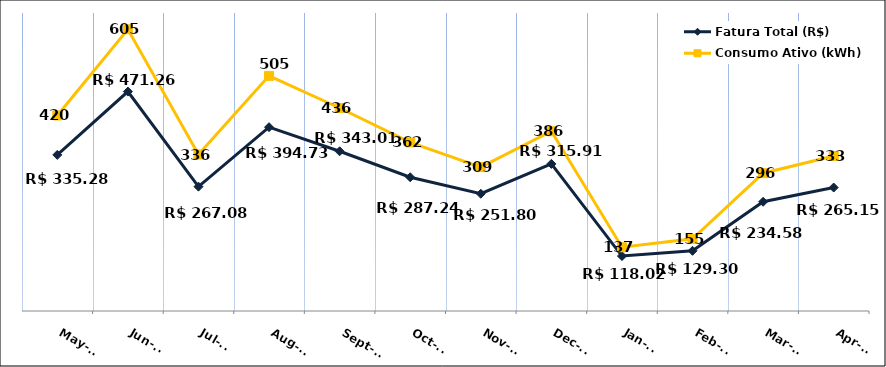
| Category | Fatura Total (R$) |
|---|---|
| 2023-05-01 | 335.28 |
| 2023-06-01 | 471.26 |
| 2023-07-01 | 267.08 |
| 2023-08-01 | 394.73 |
| 2023-09-01 | 343.01 |
| 2023-10-01 | 287.24 |
| 2023-11-01 | 251.8 |
| 2023-12-01 | 315.91 |
| 2024-01-01 | 118.02 |
| 2024-02-01 | 129.3 |
| 2024-03-01 | 234.58 |
| 2024-04-01 | 265.15 |